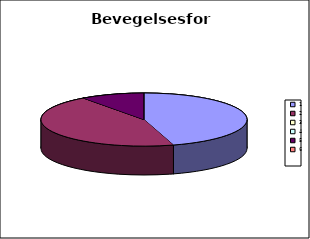
| Category | Bevegelsesform |
|---|---|
| 0 | 5.9 |
| 1 | 5.8 |
| 2 | 0 |
| 3 | 0 |
| 4 | 1.3 |
| 5 | 0 |